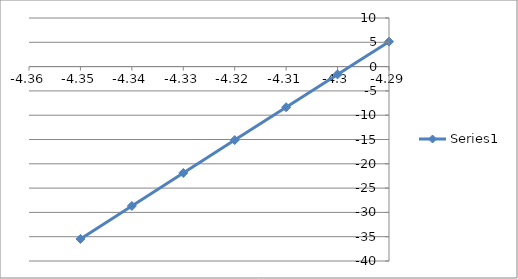
| Category | Series 0 |
|---|---|
| -4.35 | -35.463 |
| -4.34 | -28.671 |
| -4.33 | -21.889 |
| -4.32 | -15.118 |
| -4.31 | -8.357 |
| -4.3 | -1.607 |
| -4.29 | 5.132 |